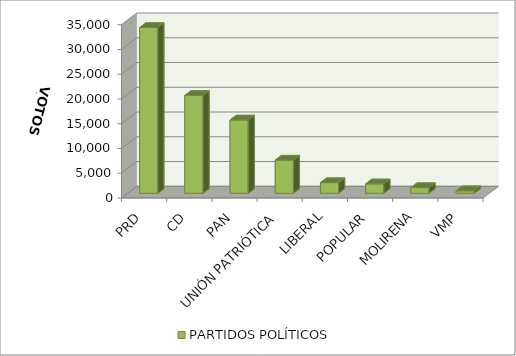
| Category | PARTIDOS POLÍTICOS |
|---|---|
| PRD | 33489 |
| CD | 19782 |
| PAN | 14815 |
| UNIÓN PATRIÓTICA | 6715 |
| LIBERAL | 2157 |
| POPULAR | 1915 |
| MOLIRENA | 1160 |
| VMP | 512 |